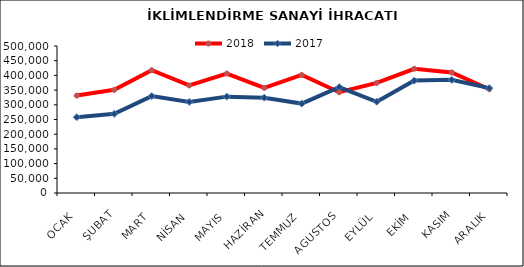
| Category | 2018 | 2017 |
|---|---|---|
| OCAK | 331308.776 | 257694.123 |
| ŞUBAT | 350922.1 | 269330.11 |
| MART | 417498.915 | 329519.413 |
| NİSAN | 365936.321 | 309734.945 |
| MAYIS | 406284.347 | 327785.217 |
| HAZİRAN | 357654.24 | 324148.236 |
| TEMMUZ | 401517.577 | 304112.897 |
| AGUSTOS | 342751.879 | 360308.326 |
| EYLÜL | 374336.049 | 310390.505 |
| EKİM | 422536.865 | 382331.833 |
| KASIM | 410024.768 | 384804.532 |
| ARALIK | 352948.759 | 356649.667 |